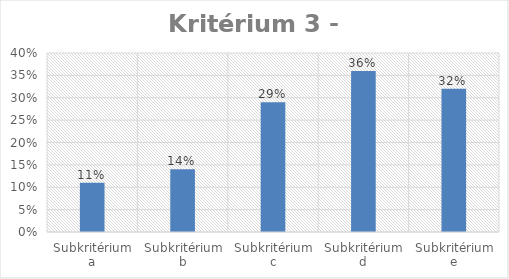
| Category | Series 0 |
|---|---|
| Subkritérium a | 0.11 |
| Subkritérium b | 0.14 |
| Subkritérium c | 0.29 |
| Subkritérium d | 0.36 |
| Subkritérium e | 0.32 |